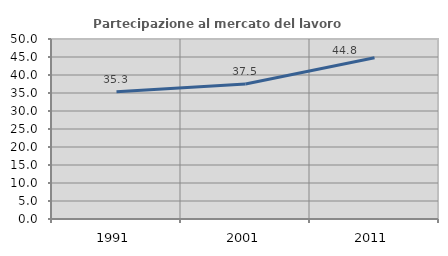
| Category | Partecipazione al mercato del lavoro  femminile |
|---|---|
| 1991.0 | 35.345 |
| 2001.0 | 37.498 |
| 2011.0 | 44.814 |